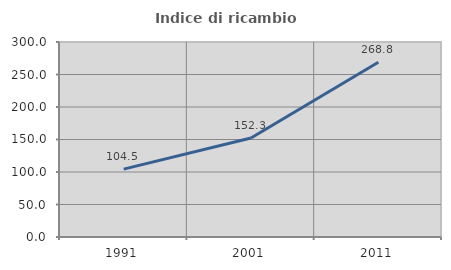
| Category | Indice di ricambio occupazionale  |
|---|---|
| 1991.0 | 104.453 |
| 2001.0 | 152.307 |
| 2011.0 | 268.784 |